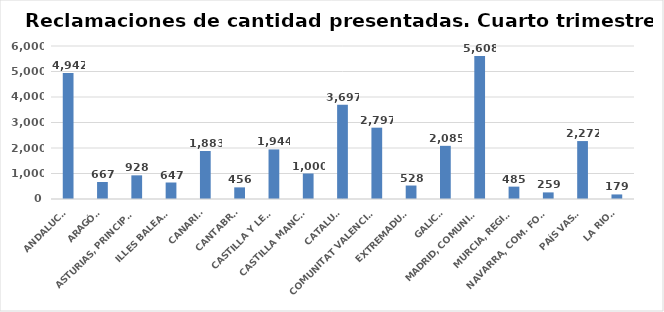
| Category | Series 0 |
|---|---|
| ANDALUCÍA | 4942 |
| ARAGÓN | 667 |
| ASTURIAS, PRINCIPADO | 928 |
| ILLES BALEARS | 647 |
| CANARIAS | 1883 |
| CANTABRIA | 456 |
| CASTILLA Y LEÓN | 1944 |
| CASTILLA MANCHA | 1000 |
| CATALUÑA | 3697 |
| COMUNITAT VALENCIANA | 2797 |
| EXTREMADURA | 528 |
| GALICIA | 2085 |
| MADRID, COMUNIDAD | 5608 |
| MURCIA, REGIÓN | 485 |
| NAVARRA, COM. FORAL | 259 |
| PAÍS VASCO | 2272 |
| LA RIOJA | 179 |